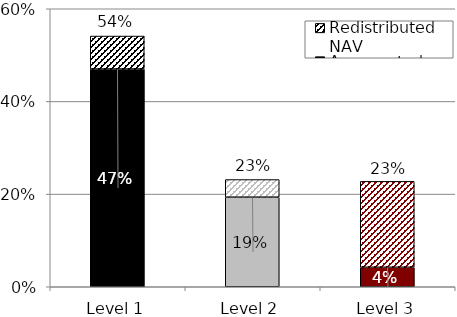
| Category | As reported | Redistributed NAV  |
|---|---|---|
| Level 1 | 0.47 | 0.071 |
| Level 2 | 0.193 | 0.038 |
| Level 3 | 0.042 | 0.185 |